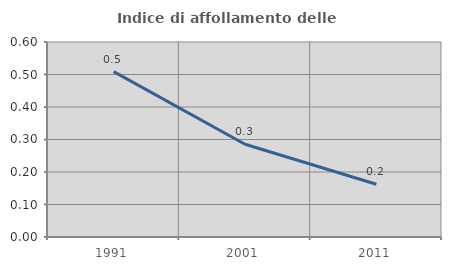
| Category | Indice di affollamento delle abitazioni  |
|---|---|
| 1991.0 | 0.509 |
| 2001.0 | 0.285 |
| 2011.0 | 0.162 |